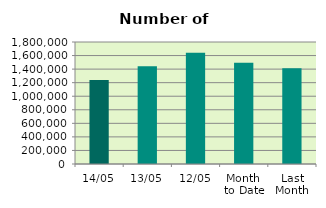
| Category | Series 0 |
|---|---|
| 14/05 | 1238708 |
| 13/05 | 1443330 |
| 12/05 | 1640664 |
| Month 
to Date | 1494013 |
| Last
Month | 1414476.2 |